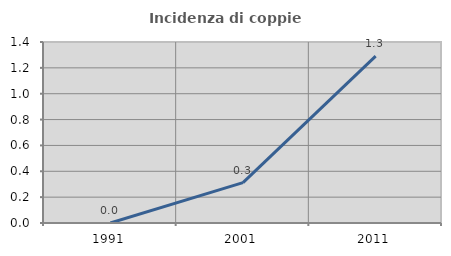
| Category | Incidenza di coppie miste |
|---|---|
| 1991.0 | 0 |
| 2001.0 | 0.312 |
| 2011.0 | 1.29 |